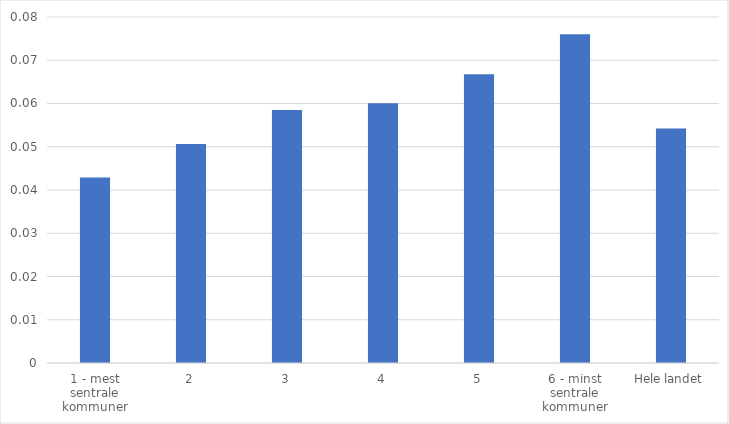
| Category | Series 0 |
|---|---|
| 1 - mest sentrale kommuner | 0.043 |
| 2 | 0.051 |
| 3 | 0.059 |
| 4 | 0.06 |
| 5 | 0.067 |
| 6 - minst sentrale kommuner | 0.076 |
| Hele landet | 0.054 |